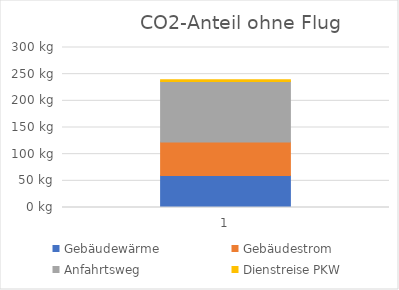
| Category | Gebäudewärme | Gebäudestrom | Anfahrtsweg | Dienstreise PKW |
|---|---|---|---|---|
| 0 | 60 | 63 | 113.04 | 3.297 |